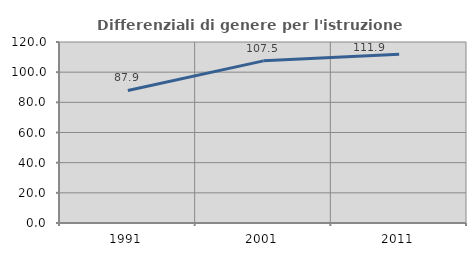
| Category | Differenziali di genere per l'istruzione superiore |
|---|---|
| 1991.0 | 87.869 |
| 2001.0 | 107.501 |
| 2011.0 | 111.871 |